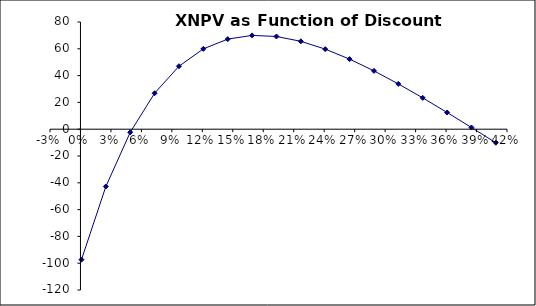
| Category | Series 0 |
|---|---|
| 0.001 | -97.366 |
| 0.025 | -42.753 |
| 0.049 | -2.31 |
| 0.073 | 26.837 |
| 0.097 | 46.983 |
| 0.121 | 59.961 |
| 0.145 | 67.24 |
| 0.169 | 70 |
| 0.193 | 69.191 |
| 0.217 | 65.578 |
| 0.241 | 59.78 |
| 0.265 | 52.296 |
| 0.289 | 43.528 |
| 0.313 | 33.803 |
| 0.337 | 23.384 |
| 0.361 | 12.484 |
| 0.385 | 1.272 |
| 0.409 | -10.113 |